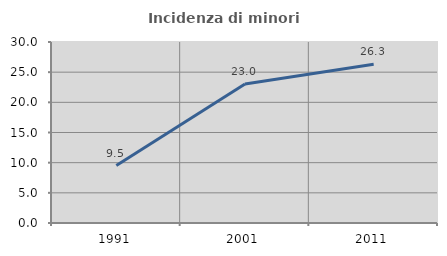
| Category | Incidenza di minori stranieri |
|---|---|
| 1991.0 | 9.524 |
| 2001.0 | 23.037 |
| 2011.0 | 26.316 |